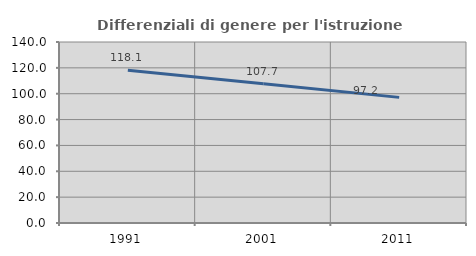
| Category | Differenziali di genere per l'istruzione superiore |
|---|---|
| 1991.0 | 118.097 |
| 2001.0 | 107.663 |
| 2011.0 | 97.166 |